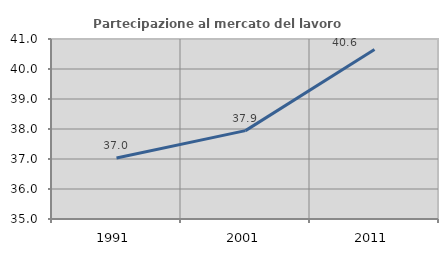
| Category | Partecipazione al mercato del lavoro  femminile |
|---|---|
| 1991.0 | 37.031 |
| 2001.0 | 37.945 |
| 2011.0 | 40.649 |